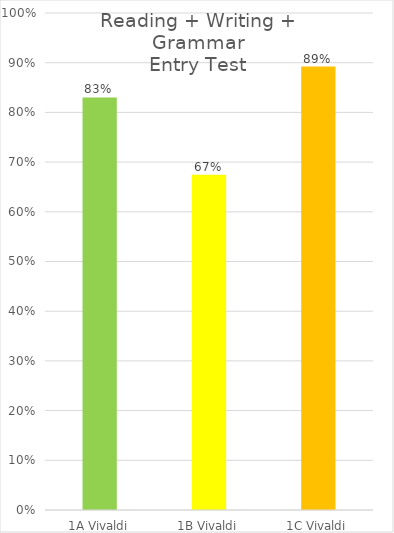
| Category | Reading + Writing + Grammar
Entry Test |
|---|---|
| 1A Vivaldi | 0.83 |
| 1B Vivaldi | 0.674 |
| 1C Vivaldi | 0.892 |